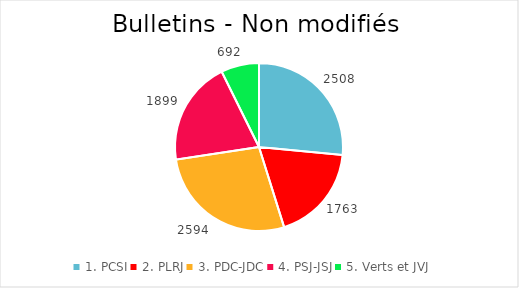
| Category | Series 0 |
|---|---|
| 1. PCSI | 2508 |
| 2. PLRJ | 1763 |
| 3. PDC-JDC | 2594 |
| 4. PSJ-JSJ | 1899 |
| 5. Verts et JVJ | 692 |